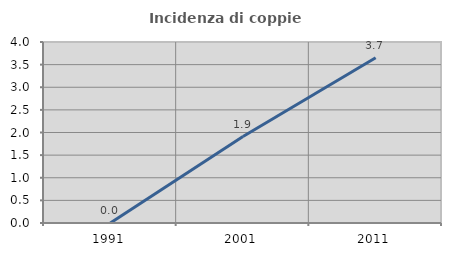
| Category | Incidenza di coppie miste |
|---|---|
| 1991.0 | 0 |
| 2001.0 | 1.911 |
| 2011.0 | 3.652 |